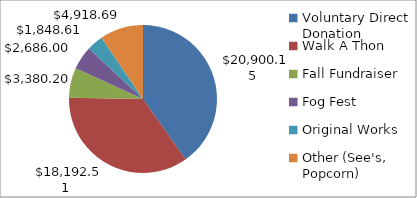
| Category | Series 0 | Series 1 |
|---|---|---|
| Voluntary Direct Donation | 20900.15 | 0.402 |
| Walk A Thon | 18192.51 | 0.35 |
| Fall Fundraiser | 3380.2 | 0.065 |
| Fog Fest | 2686 | 0.052 |
| Original Works | 1848.61 | 0.036 |
| Other (See's, Popcorn) | 4918.685 | 0.095 |